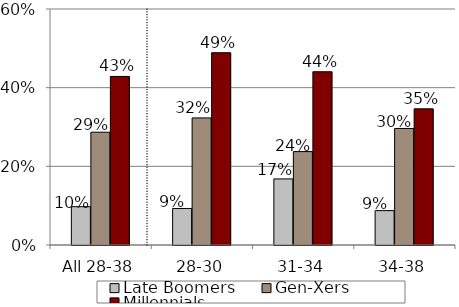
| Category | Late Boomers | Gen-Xers | Millennials |
|---|---|---|---|
| All 28-38 | 0.097 | 0.287 | 0.429 |
| 28-30 | 0.093 | 0.323 | 0.489 |
| 31-34 | 0.168 | 0.237 | 0.44 |
| 34-38 | 0.087 | 0.296 | 0.346 |